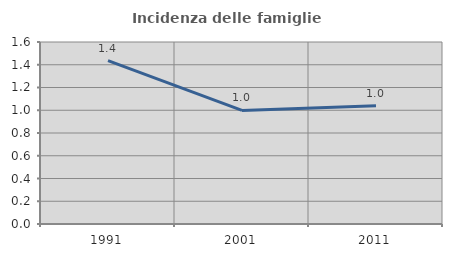
| Category | Incidenza delle famiglie numerose |
|---|---|
| 1991.0 | 1.437 |
| 2001.0 | 0.998 |
| 2011.0 | 1.039 |